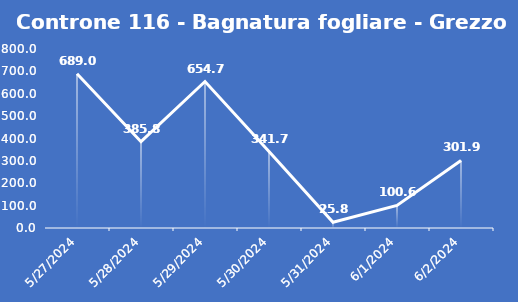
| Category | Controne 116 - Bagnatura fogliare - Grezzo (min) |
|---|---|
| 5/27/24 | 689 |
| 5/28/24 | 385.8 |
| 5/29/24 | 654.7 |
| 5/30/24 | 341.7 |
| 5/31/24 | 25.8 |
| 6/1/24 | 100.6 |
| 6/2/24 | 301.9 |